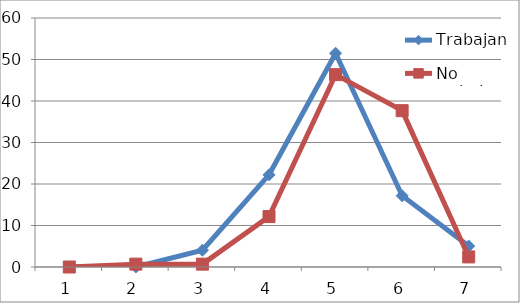
| Category | Trabajan | No trabajan |
|---|---|---|
| 0 | 0 | 0 |
| 1 | 0 | 0.69 |
| 2 | 4.04 | 0.69 |
| 3 | 22.22 | 12.15 |
| 4 | 51.51 | 46.35 |
| 5 | 17.17 | 37.67 |
| 6 | 5.05 | 2.43 |